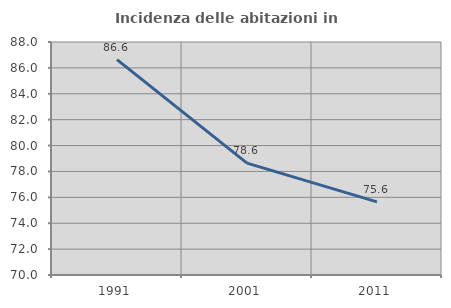
| Category | Incidenza delle abitazioni in proprietà  |
|---|---|
| 1991.0 | 86.634 |
| 2001.0 | 78.641 |
| 2011.0 | 75.648 |